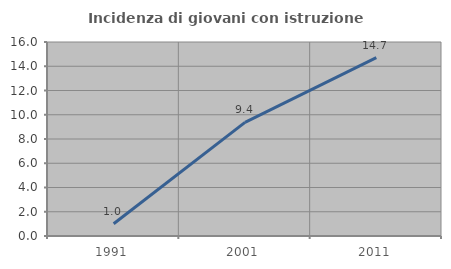
| Category | Incidenza di giovani con istruzione universitaria |
|---|---|
| 1991.0 | 1.01 |
| 2001.0 | 9.375 |
| 2011.0 | 14.706 |